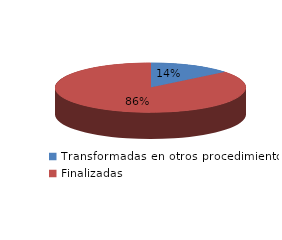
| Category | Series 0 |
|---|---|
| Transformadas en otros procedimientos | 2256 |
| Finalizadas | 13751 |